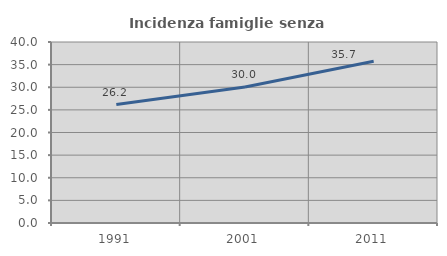
| Category | Incidenza famiglie senza nuclei |
|---|---|
| 1991.0 | 26.182 |
| 2001.0 | 30.043 |
| 2011.0 | 35.748 |